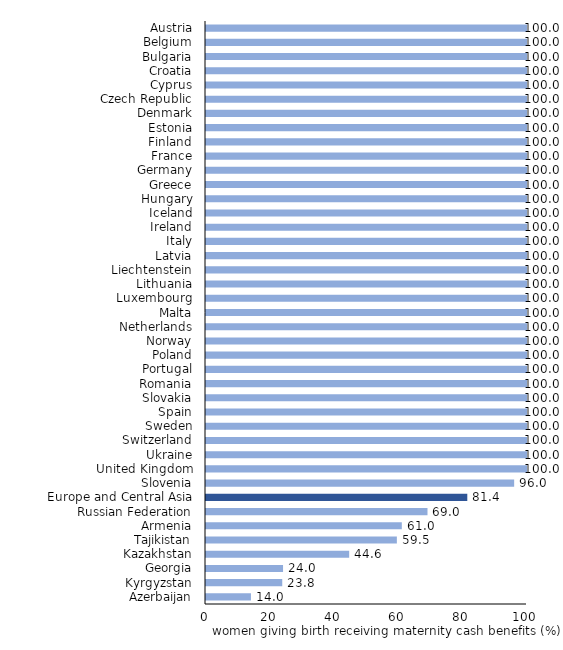
| Category | Beneficiaries of maternity benefits, % of women giving birth |
|---|---|
| Azerbaijan | 14 |
| Kyrgyzstan | 23.752 |
| Georgia | 24 |
| Kazakhstan | 44.607 |
| Tajikistan | 59.458 |
| Armenia | 61 |
| Russian Federation | 69 |
| Europe and Central Asia | 81.4 |
| Slovenia | 96 |
| United Kingdom | 100 |
| Ukraine | 100 |
| Switzerland | 100 |
| Sweden | 100 |
| Spain | 100 |
| Slovakia | 100 |
| Romania | 100 |
| Portugal | 100 |
| Poland | 100 |
| Norway | 100 |
| Netherlands | 100 |
| Malta | 100 |
| Luxembourg | 100 |
| Lithuania | 100 |
| Liechtenstein | 100 |
| Latvia | 100 |
| Italy | 100 |
| Ireland | 100 |
| Iceland | 100 |
| Hungary | 100 |
| Greece | 100 |
| Germany | 100 |
| France | 100 |
| Finland | 100 |
| Estonia | 100 |
| Denmark | 100 |
| Czech Republic | 100 |
| Cyprus | 100 |
| Croatia | 100 |
| Bulgaria | 100 |
| Belgium | 100 |
| Austria | 100 |